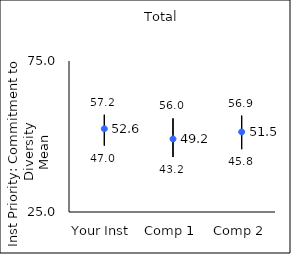
| Category | 25th percentile | 75th percentile | Mean |
|---|---|---|---|
| Your Inst | 47 | 57.2 | 52.56 |
| Comp 1 | 43.2 | 56 | 49.19 |
| Comp 2 | 45.8 | 56.9 | 51.52 |